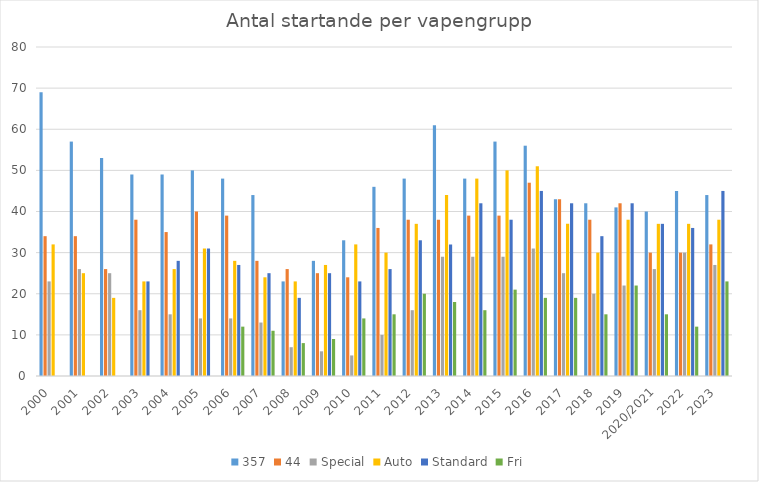
| Category | 357 | 44 | Special | Auto | Standard | Fri |
|---|---|---|---|---|---|---|
| 2000 | 69 | 34 | 23 | 32 | 0 | 0 |
| 2001 | 57 | 34 | 26 | 25 | 0 | 0 |
| 2002 | 53 | 26 | 25 | 19 | 0 | 0 |
| 2003 | 49 | 38 | 16 | 23 | 23 | 0 |
| 2004 | 49 | 35 | 15 | 26 | 28 | 0 |
| 2005 | 50 | 40 | 14 | 31 | 31 | 0 |
| 2006 | 48 | 39 | 14 | 28 | 27 | 12 |
| 2007 | 44 | 28 | 13 | 24 | 25 | 11 |
| 2008 | 23 | 26 | 7 | 23 | 19 | 8 |
| 2009 | 28 | 25 | 6 | 27 | 25 | 9 |
| 2010 | 33 | 24 | 5 | 32 | 23 | 14 |
| 2011 | 46 | 36 | 10 | 30 | 26 | 15 |
| 2012 | 48 | 38 | 16 | 37 | 33 | 20 |
| 2013 | 61 | 38 | 29 | 44 | 32 | 18 |
| 2014 | 48 | 39 | 29 | 48 | 42 | 16 |
| 2015 | 57 | 39 | 29 | 50 | 38 | 21 |
| 2016 | 56 | 47 | 31 | 51 | 45 | 19 |
| 2017 | 43 | 43 | 25 | 37 | 42 | 19 |
| 2018 | 42 | 38 | 20 | 30 | 34 | 15 |
| 2019 | 41 | 42 | 22 | 38 | 42 | 22 |
| 2020/2021 | 40 | 30 | 26 | 37 | 37 | 15 |
| 2022 | 45 | 30 | 30 | 37 | 36 | 12 |
| 2023 | 44 | 32 | 27 | 38 | 45 | 23 |